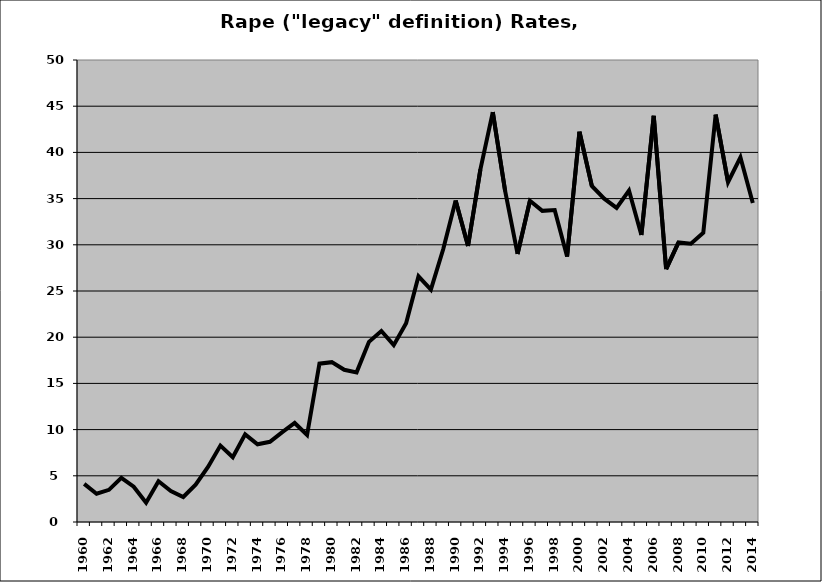
| Category | Rape |
|---|---|
| 1960.0 | 4.119 |
| 1961.0 | 3.06 |
| 1962.0 | 3.481 |
| 1963.0 | 4.785 |
| 1964.0 | 3.823 |
| 1965.0 | 2.093 |
| 1966.0 | 4.405 |
| 1967.0 | 3.353 |
| 1968.0 | 2.707 |
| 1969.0 | 4.045 |
| 1970.0 | 5.965 |
| 1971.0 | 8.268 |
| 1972.0 | 7.004 |
| 1973.0 | 9.482 |
| 1974.0 | 8.416 |
| 1975.0 | 8.68 |
| 1976.0 | 9.732 |
| 1977.0 | 10.718 |
| 1978.0 | 9.414 |
| 1979.0 | 17.136 |
| 1980.0 | 17.299 |
| 1981.0 | 16.471 |
| 1982.0 | 16.193 |
| 1983.0 | 19.499 |
| 1984.0 | 20.676 |
| 1985.0 | 19.138 |
| 1986.0 | 21.519 |
| 1987.0 | 26.585 |
| 1988.0 | 25.16 |
| 1989.0 | 29.539 |
| 1990.0 | 34.798 |
| 1991.0 | 29.864 |
| 1992.0 | 38.164 |
| 1993.0 | 44.356 |
| 1994.0 | 35.796 |
| 1995.0 | 29.007 |
| 1996.0 | 34.768 |
| 1997.0 | 33.674 |
| 1998.0 | 33.755 |
| 1999.0 | 28.723 |
| 2000.0 | 42.24 |
| 2001.0 | 36.368 |
| 2002.0 | 34.997 |
| 2003.0 | 33.988 |
| 2004.0 | 35.869 |
| 2005.0 | 31.068 |
| 2006.0 | 43.958 |
| 2007.0 | 27.359 |
| 2008.0 | 30.26 |
| 2009.0 | 30.123 |
| 2010.0 | 31.296 |
| 2011.0 | 44.088 |
| 2012.0 | 36.773 |
| 2013.0 | 39.467 |
| 2014.0 | 34.519 |